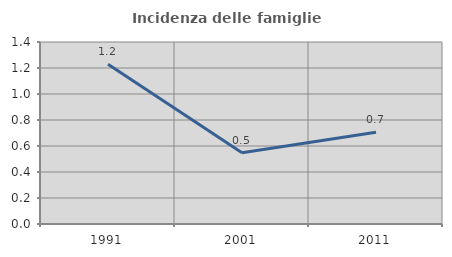
| Category | Incidenza delle famiglie numerose |
|---|---|
| 1991.0 | 1.229 |
| 2001.0 | 0.549 |
| 2011.0 | 0.705 |